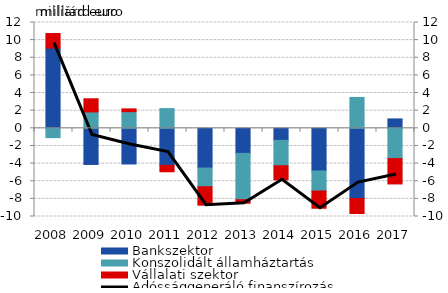
| Category | Bankszektor | Konszolidált államháztartás | Vállalati szektor |
|---|---|---|---|
| 2008.0 | 9.098 | -1.057 | 1.65 |
| 2009.0 | -4.099 | 1.858 | 1.491 |
| 2010.0 | -4.044 | 1.889 | 0.314 |
| 2011.0 | -4.201 | 2.238 | -0.726 |
| 2012.0 | -4.507 | -2.115 | -2.09 |
| 2013.0 | -2.84 | -5.254 | -0.397 |
| 2014.0 | -1.365 | -2.877 | -1.598 |
| 2015.0 | -4.835 | -2.278 | -1.952 |
| 2016.0 | -7.965 | 3.5 | -1.693 |
| 2017.0 | 1.068 | -3.434 | -2.873 |